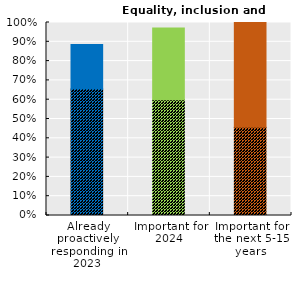
| Category | Equality, inclusion and diversity | Series 1 |
|---|---|---|
| Already proactively responding in 2023 | 0.657 | 0.229 |
| Important for
2024 | 0.6 | 0.371 |
| Important for
the next 5-15 years | 0.457 | 0.543 |